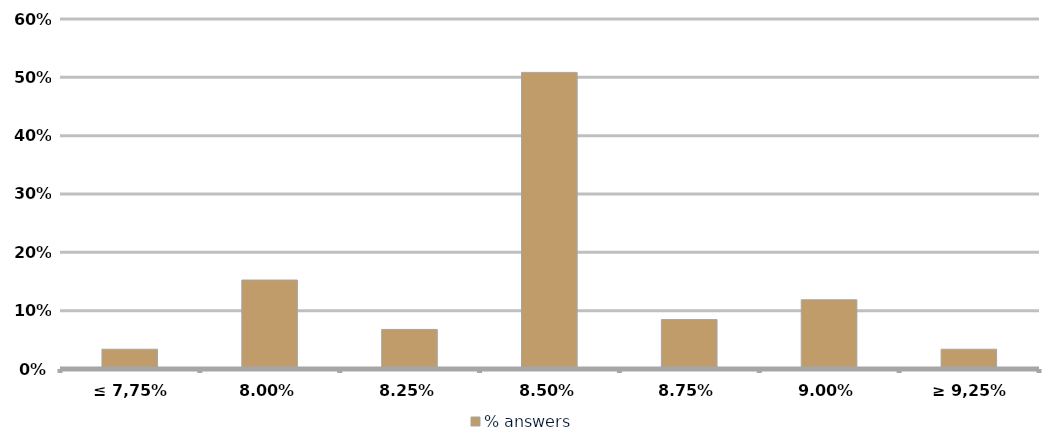
| Category | % answers |
|---|---|
| ≤ 7,75% | 0.034 |
| 8,00% | 0.153 |
| 8,25% | 0.068 |
| 8,50% | 0.508 |
| 8,75% | 0.085 |
| 9,00% | 0.119 |
| ≥ 9,25% | 0.034 |